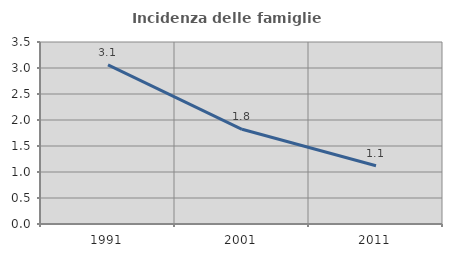
| Category | Incidenza delle famiglie numerose |
|---|---|
| 1991.0 | 3.06 |
| 2001.0 | 1.821 |
| 2011.0 | 1.119 |